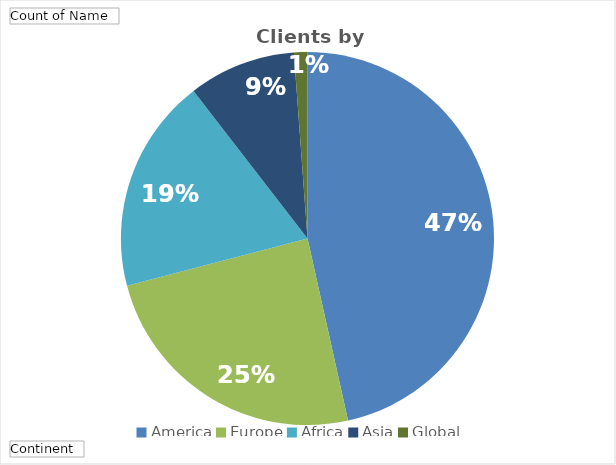
| Category | Total |
|---|---|
| America | 40 |
| Europe | 21 |
| Africa | 16 |
| Asia | 8 |
| Global | 1 |